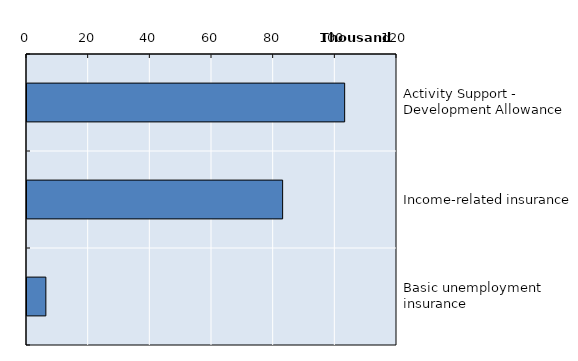
| Category | Series 0 |
|---|---|
| Activity Support - Development Allowance | 103027.25 |
| Income-related insurance | 82908 |
| Basic unemployment insurance | 6117 |